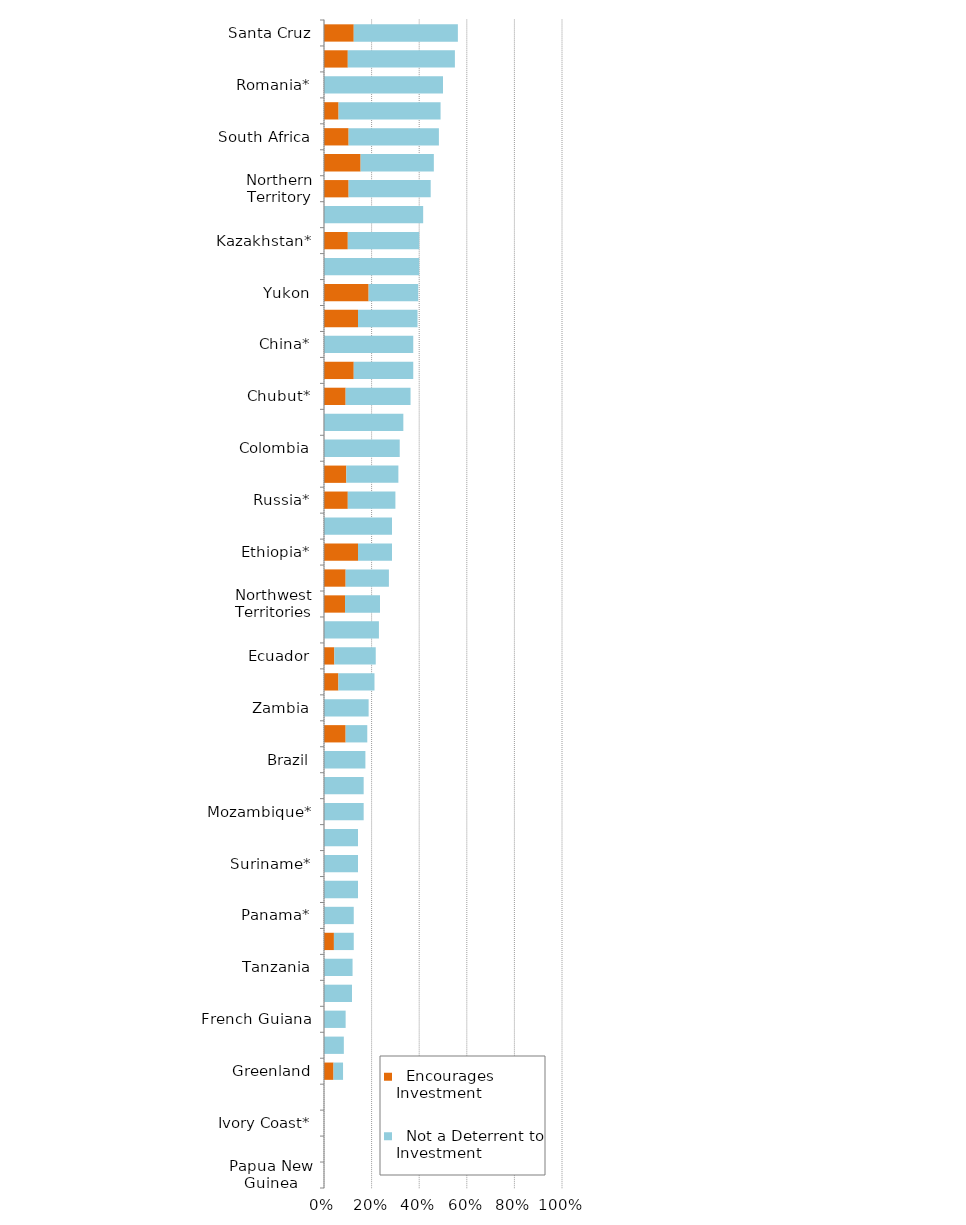
| Category |   Encourages Investment |   Not a Deterrent to Investment |
|---|---|---|
| Papua New Guinea | 0 | 0 |
| Philippines* | 0 | 0 |
| Ivory Coast* | 0 | 0 |
| Guatemala | 0 | 0 |
| Greenland | 0.04 | 0.04 |
| Democratic Republic of Congo (DRC) | 0 | 0.083 |
| French Guiana | 0 | 0.091 |
| Mali | 0 | 0.118 |
| Tanzania | 0 | 0.12 |
| Indonesia | 0.042 | 0.083 |
| Panama* | 0 | 0.125 |
| Burkina Faso | 0 | 0.143 |
| Suriname* | 0 | 0.143 |
| Venezuela | 0 | 0.143 |
| Mozambique* | 0 | 0.167 |
| Zimbabwe | 0 | 0.167 |
| Brazil | 0 | 0.174 |
| Nicaragua* | 0.091 | 0.091 |
| Zambia | 0 | 0.188 |
| Nunavut | 0.061 | 0.152 |
| Ecuador | 0.043 | 0.174 |
| Bolivia | 0 | 0.231 |
| Northwest Territories | 0.088 | 0.147 |
| Mongolia* | 0.091 | 0.182 |
| Ethiopia* | 0.143 | 0.143 |
| Guyana* | 0 | 0.286 |
| Russia* | 0.1 | 0.2 |
| Alaska | 0.094 | 0.219 |
| Colombia | 0 | 0.318 |
| Dominican Republic* | 0 | 0.333 |
| Chubut* | 0.091 | 0.273 |
| Catamarca* | 0.125 | 0.25 |
| China* | 0 | 0.375 |
| Namibia | 0.143 | 0.25 |
| Yukon | 0.188 | 0.208 |
| Kenya* | 0 | 0.4 |
| Kazakhstan* | 0.1 | 0.3 |
| Ghana | 0 | 0.417 |
| Northern Territory | 0.103 | 0.345 |
| Fiji | 0.154 | 0.308 |
| South Africa | 0.103 | 0.379 |
| Peru | 0.061 | 0.429 |
| Romania* | 0 | 0.5 |
| New Zealand | 0.1 | 0.45 |
| Santa Cruz | 0.125 | 0.438 |